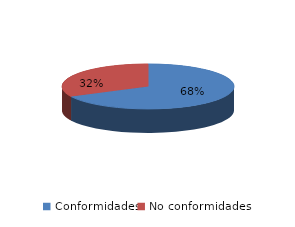
| Category | Series 0 |
|---|---|
| Conformidades | 1187 |
| No conformidades | 571 |